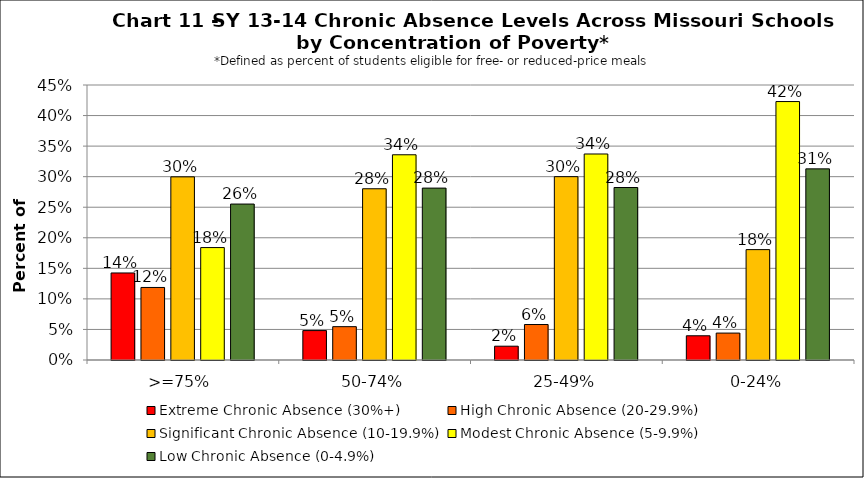
| Category | Extreme Chronic Absence (30%+) | High Chronic Absence (20-29.9%) | Significant Chronic Absence (10-19.9%) | Modest Chronic Absence (5-9.9%) | Low Chronic Absence (0-4.9%) |
|---|---|---|---|---|---|
| 0 | 0.142 | 0.119 | 0.3 | 0.184 | 0.255 |
| 1 | 0.048 | 0.055 | 0.28 | 0.336 | 0.281 |
| 2 | 0.023 | 0.058 | 0.3 | 0.337 | 0.282 |
| 3 | 0.04 | 0.044 | 0.181 | 0.423 | 0.313 |